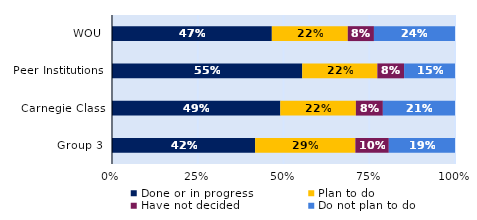
| Category | Done or in progress | Plan to do | Have not decided | Do not plan to do |
|---|---|---|---|---|
| WOU | 0.466 | 0.221 | 0.076 | 0.236 |
| Peer Institutions | 0.555 | 0.219 | 0.078 | 0.148 |
| Carnegie Class | 0.491 | 0.22 | 0.079 | 0.21 |
| Group 3 | 0.417 | 0.292 | 0.098 | 0.193 |